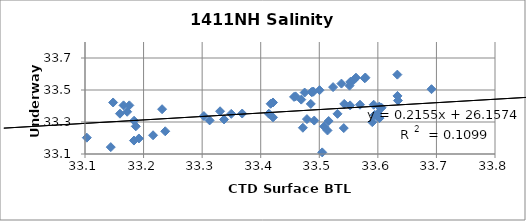
| Category | Salinity  |
|---|---|
| 33.576 | 32.988 |
| 33.4977 | 33.04 |
| 33.6333 | 33.596 |
| 33.6335 | 33.463 |
| 33.6063 | 33.389 |
| 33.6343 | 33.434 |
| 33.5418 | 33.262 |
| 33.5426 | 33.413 |
| 33.6916 | 33.505 |
| 33.5695 | 33.408 |
| 33.421 | 33.329 |
| 33.4138 | 33.352 |
| 33.1658 | 33.404 |
| 33.0835 | 33.587 |
| 33.1597 | 33.352 |
| 33.516 | 33.306 |
| 33.0359 | 33.2 |
| 33.1757 | 33.404 |
| 33.172 | 33.364 |
| 33.1838 | 33.308 |
| 33.1867 | 33.273 |
| 33.2316 | 33.38 |
| 33.303 | 33.337 |
| 33.3374 | 33.316 |
| 33.4914 | 33.309 |
| 33.5983 | 33.337 |
| 33.5944 | 33.344 |
| 33.6 | 33.354 |
| 33.5905 | 33.299 |
| 33.5083 | 33.272 |
| 33.514 | 33.247 |
| 33.505 | 33.11 |
| 33.5526 | 33.404 |
| 33.5929 | 33.408 |
| 33.6024 | 33.396 |
| 33.6027 | 33.324 |
| 33.5311 | 33.351 |
| 33.472 | 33.264 |
| 33.4789 | 33.318 |
| 33.4855 | 33.413 |
| 33.3306 | 33.367 |
| 33.0956 | 33.348 |
| 33.1031 | 33.202 |
| 33.148 | 33.422 |
| 33.0127 | 33.423 |
| 33.3684 | 33.353 |
| 34.3081 | 33.302 |
| 33.0369 | 33.036 |
| 33.421 | 33.422 |
| 33.3497 | 33.351 |
| 33.5777 | 33.573 |
| 33.4595 | 33.46 |
| 33.5005 | 33.499 |
| 33.4889 | 33.488 |
| 33.1836 | 33.184 |
| 33.4569 | 33.457 |
| 33.5236 | 33.518 |
| 33.3128 | 33.31 |
| 32.9614 | 32.958 |
| 33.192 | 33.197 |
| 33.2162 | 33.217 |
| 33.144 | 33.143 |
| 33.237 | 33.242 |
| 33.4899 | 33.49 |
| 33.4868 | 33.487 |
| 33.475 | 33.484 |
| 33.4692 | 33.44 |
| 33.417 | 33.414 |
| 33.5531 | 33.551 |
| 33.5378 | 33.54 |
| 33.5786 | 33.578 |
| 33.5626 | 33.577 |
| 33.5586 | 33.562 |
| 33.5516 | 33.527 |